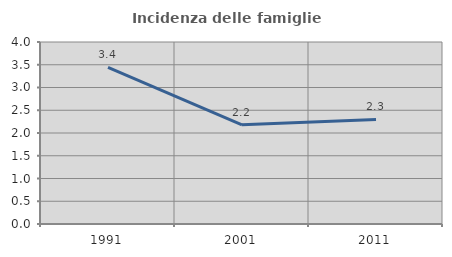
| Category | Incidenza delle famiglie numerose |
|---|---|
| 1991.0 | 3.443 |
| 2001.0 | 2.179 |
| 2011.0 | 2.299 |